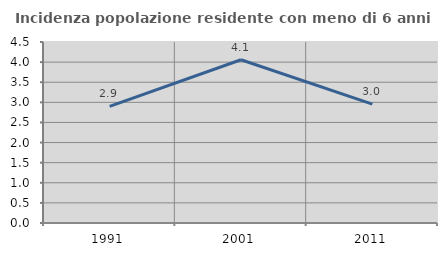
| Category | Incidenza popolazione residente con meno di 6 anni |
|---|---|
| 1991.0 | 2.899 |
| 2001.0 | 4.06 |
| 2011.0 | 2.956 |